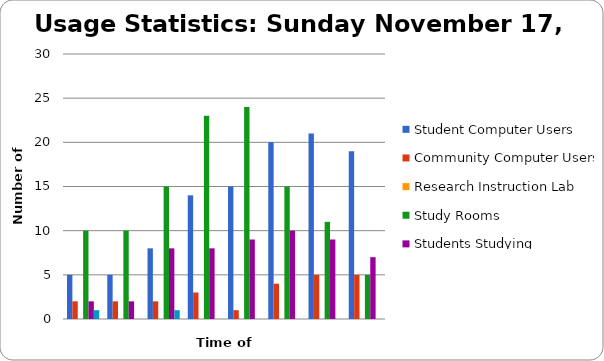
| Category | Student Computer Users | Community Computer Users | Research Instruction Lab | Study Rooms | Students Studying | Community Studying |
|---|---|---|---|---|---|---|
| 10 am | 5 | 2 | 0 | 10 | 2 | 1 |
| 11 am | 5 | 2 | 0 | 10 | 2 | 0 |
| 12 pm | 8 | 2 | 0 | 15 | 8 | 1 |
| 1 pm | 14 | 3 | 0 | 23 | 8 | 0 |
| 2 pm | 15 | 1 | 0 | 24 | 9 | 0 |
| 3 pm | 20 | 4 | 0 | 15 | 10 | 0 |
| 4 pm | 21 | 5 | 0 | 11 | 9 | 0 |
| 5 pm | 19 | 5 | 0 | 5 | 7 | 0 |